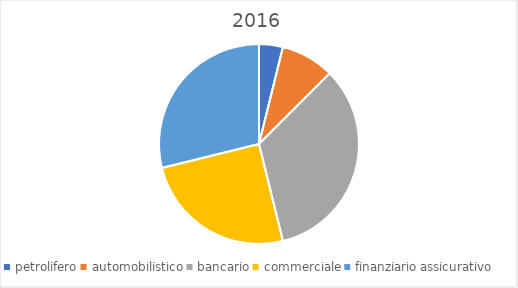
| Category | Series 0 |
|---|---|
| petrolifero | 8 |
| automobilistico | 18 |
| bancario | 70 |
| commerciale | 52 |
| finanziario assicurativo | 60 |